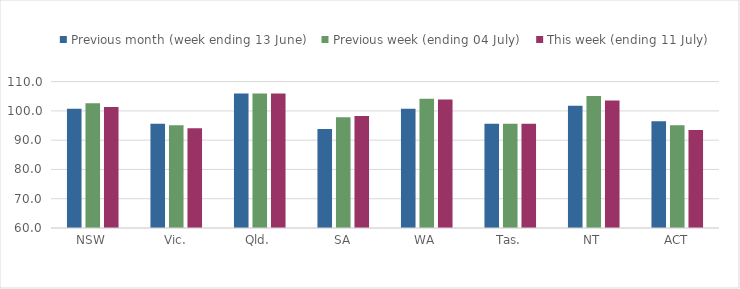
| Category | Previous month (week ending 13 June) | Previous week (ending 04 July) | This week (ending 11 July) |
|---|---|---|---|
| NSW | 100.751 | 102.579 | 101.37 |
| Vic. | 95.58 | 95.12 | 94.046 |
| Qld. | 105.964 | 105.964 | 105.964 |
| SA | 93.852 | 97.834 | 98.287 |
| WA | 100.724 | 104.168 | 103.899 |
| Tas. | 95.604 | 95.604 | 95.604 |
| NT | 101.74 | 105.093 | 103.594 |
| ACT | 96.503 | 95.13 | 93.515 |